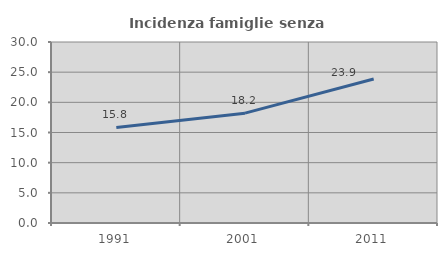
| Category | Incidenza famiglie senza nuclei |
|---|---|
| 1991.0 | 15.833 |
| 2001.0 | 18.204 |
| 2011.0 | 23.856 |